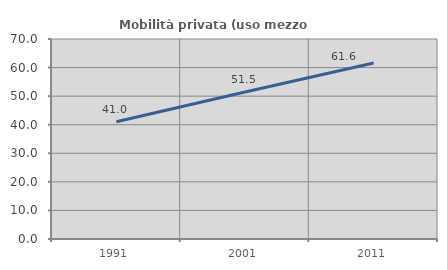
| Category | Mobilità privata (uso mezzo privato) |
|---|---|
| 1991.0 | 41.037 |
| 2001.0 | 51.467 |
| 2011.0 | 61.596 |